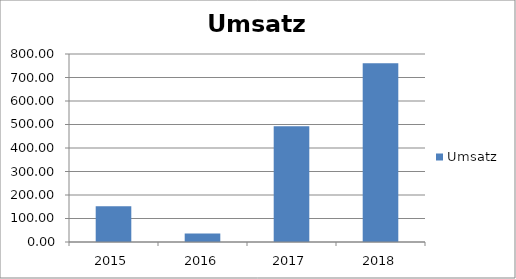
| Category | Umsatz |
|---|---|
| 2015.0 | 152 |
| 2016.0 | 36 |
| 2017.0 | 493 |
| 2018.0 | 761 |